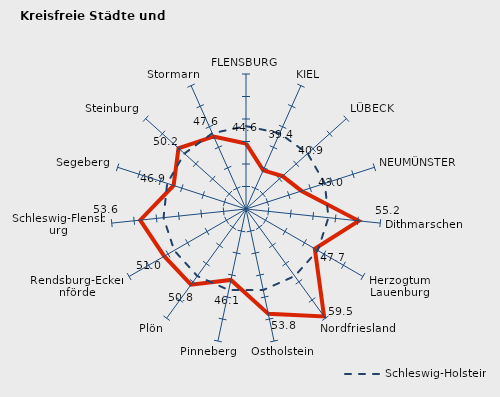
| Category | Kreise | Schleswig-Holstein |
|---|---|---|
| FLENSBURG | 44.568 | 48.418 |
| KIEL | 39.403 | 48.418 |
| LÜBECK | 40.918 | 48.418 |
| NEUMÜNSTER | 42.983 | 48.418 |
| Dithmarschen | 55.173 | 48.418 |
| Herzogtum Lauenburg | 47.652 | 48.418 |
| Nordfriesland | 59.52 | 48.418 |
| Ostholstein | 53.823 | 48.418 |
| Pinneberg | 46.109 | 48.418 |
| Plön | 50.803 | 48.418 |
| Rendsburg-Eckernförde | 50.986 | 48.418 |
| Schleswig-Flensburg | 53.638 | 48.418 |
| Segeberg | 46.921 | 48.418 |
| Steinburg | 50.179 | 48.418 |
| Stormarn | 47.646 | 48.418 |